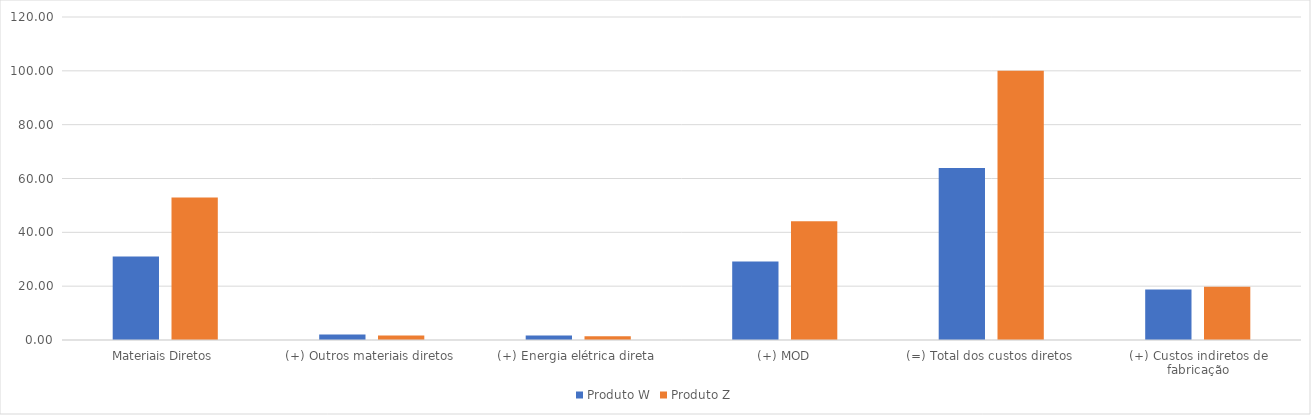
| Category | Produto W | Produto Z |
|---|---|---|
| Materiais Diretos | 31.051 | 52.914 |
| (+) Outros materiais diretos | 2 | 1.647 |
| (+) Energia elétrica direta | 1.667 | 1.412 |
| (+) MOD | 29.145 | 44.084 |
| (=) Total dos custos diretos | 63.862 | 100.057 |
| (+) Custos indiretos de fabricação | 18.751 | 19.812 |